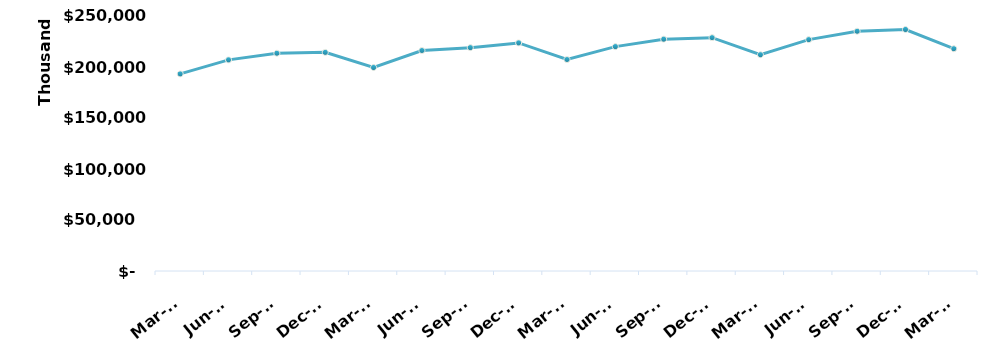
| Category | Total |
|---|---|
| Mar-15 | 193214760.65 |
| Jun-15 | 206971890.35 |
| Sep-15 | 213490881.83 |
| Dec-15 | 214349105.84 |
| Mar-16 | 199493745.37 |
| Jun-16 | 216148419.22 |
| Sep-16 | 218976889.8 |
| Dec-16 | 223617895.79 |
| Mar-17 | 207333812.45 |
| Jun-17 | 219981727.55 |
| Sep-17 | 227293496.76 |
| Dec-17 | 228775828.16 |
| Mar-18 | 212038702.39 |
| Jun-18 | 226827967.75 |
| Sep-18 | 235037993.57 |
| Dec-18 | 236773515.07 |
| Mar-19 | 217929233.04 |